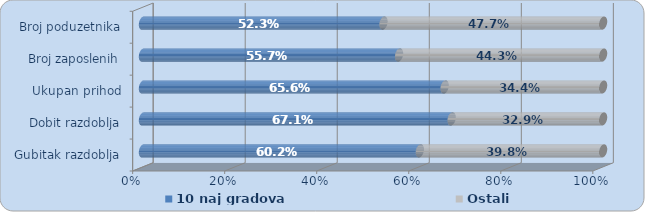
| Category | 10 naj gradova | Ostali |
|---|---|---|
| Gubitak razdoblja | 0.602 | 0.398 |
| Dobit razdoblja | 0.671 | 0.329 |
| Ukupan prihod | 0.656 | 0.344 |
| Broj zaposlenih | 0.557 | 0.443 |
| Broj poduzetnika | 0.523 | 0.477 |